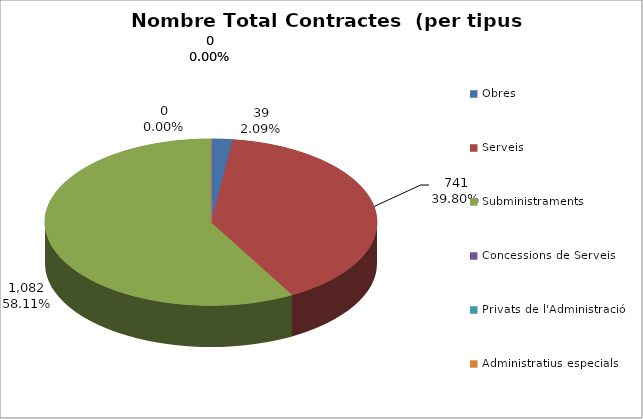
| Category | Nombre Total Contractes |
|---|---|
| Obres | 39 |
| Serveis | 741 |
| Subministraments | 1082 |
| Concessions de Serveis | 0 |
| Privats de l'Administració | 0 |
| Administratius especials | 0 |